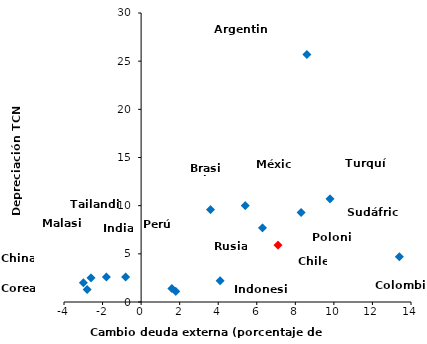
| Category | Series 0 |
|---|---|
| 8.6 | 25.7 |
| 3.6 | 9.6 |
| 7.1 | 5.9 |
| -3.0 | 2 |
| 13.4 | 4.7 |
| 5.4 | 10 |
| 1.6 | 1.4 |
| -0.8 | 2.6 |
| 1.8 | 1.1 |
| -2.6 | 2.5 |
| -2.8000000000000007 | 1.3 |
| -1.7999999999999972 | 2.6 |
| 6.3 | 7.7 |
| 4.1 | 2.2 |
| 8.3 | 9.3 |
| 9.8 | 10.7 |